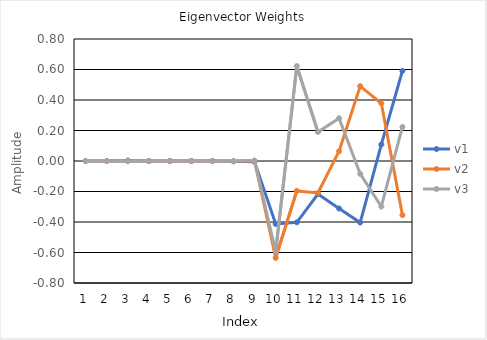
| Category | v1 | v2 | v3 |
|---|---|---|---|
| 1.0 | 0 | 0 | 0 |
| 2.0 | 0 | 0 | 0 |
| 3.0 | 0.002 | 0.003 | -0.002 |
| 4.0 | 0 | 0 | 0 |
| 5.0 | 0 | 0 | 0 |
| 6.0 | 0 | 0 | 0 |
| 7.0 | 0 | 0.001 | 0.001 |
| 8.0 | -0.002 | -0.001 | 0.001 |
| 9.0 | -0.006 | 0.001 | 0.003 |
| 10.0 | -0.413 | -0.636 | -0.594 |
| 11.0 | -0.402 | -0.196 | 0.622 |
| 12.0 | -0.217 | -0.21 | 0.19 |
| 13.0 | -0.311 | 0.064 | 0.28 |
| 14.0 | -0.403 | 0.491 | -0.085 |
| 15.0 | 0.108 | 0.378 | -0.298 |
| 16.0 | 0.591 | -0.355 | 0.223 |